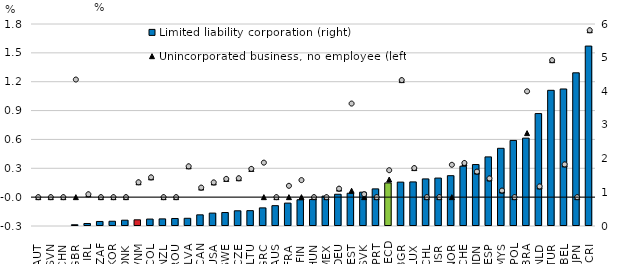
| Category | Limited liability corporation (right) | OECDGraphFakeSeries |
|---|---|---|
| AUT    | 0 |  |
| SVN    | 0 |  |
| CHN    | 0 |  |
| GBR    | 0.037 |  |
| IRL    | 0.075 |  |
| ZAF    | 0.135 |  |
| KOR    | 0.141 |  |
| DNK    | 0.172 |  |
| VNM    | 0.184 |  |
| COL    | 0.206 |  |
| NZL    | 0.211 |  |
| ROU    | 0.223 |  |
| LVA    | 0.229 |  |
| CAN    | 0.332 |  |
| USA    | 0.383 |  |
| SWE    | 0.4 |  |
| CZE    | 0.452 |  |
| LTU    | 0.456 |  |
| GRC    | 0.538 |  |
| AUS    | 0.604 |  |
| FRA    | 0.68 |  |
| FIN    | 0.78 |  |
| HUN    | 0.788 |  |
| MEX    | 0.888 |  |
| DEU    | 0.943 |  |
| EST    | 0.973 |  |
| SVK    | 1.005 |  |
| PRT    | 1.103 |  |
| OECD   | 1.279 |  |
| BGR    | 1.304 |  |
| LUX    | 1.309 |  |
| CHL    | 1.399 |  |
| ISR    | 1.424 |  |
| NOR    | 1.495 |  |
| CHE    | 1.776 |  |
| IDN    | 1.825 |  |
| ESP    | 2.052 |  |
| MYS    | 2.308 |  |
| POL    | 2.542 |  |
| BRA    | 2.61 |  |
| NLD    | 3.34 |  |
| TUR    | 4.031 |  |
| BEL    | 4.07 |  |
| JPN    | 4.55 |  |
| CRI    | 5.344 |  |